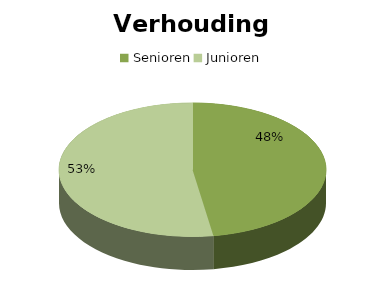
| Category | Series 0 |
|---|---|
| Senioren | 190 |
| Junioren | 210 |